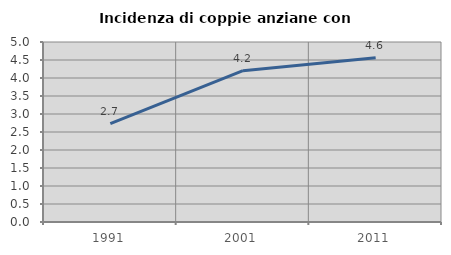
| Category | Incidenza di coppie anziane con figli |
|---|---|
| 1991.0 | 2.734 |
| 2001.0 | 4.202 |
| 2011.0 | 4.561 |